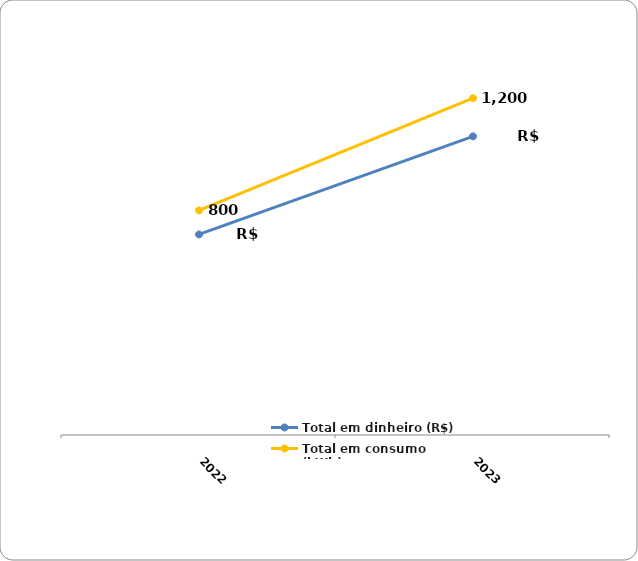
| Category | Total em dinheiro (R$) | Total em consumo (kWh) |
|---|---|---|
| 2022.0 | 714.39 | 800 |
| 2023.0 | 1063.83 | 1200 |